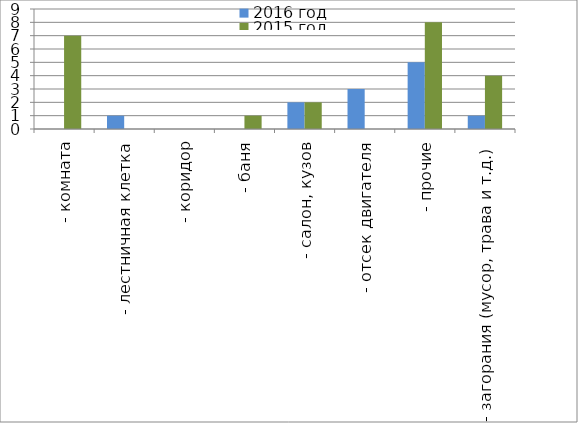
| Category | 2016 год | 2015 год |
|---|---|---|
|  - комната | 0 | 7 |
|  - лестничная клетка | 1 | 0 |
|  - коридор | 0 | 0 |
|  - баня | 0 | 1 |
|  - салон, кузов | 2 | 2 |
|  - отсек двигателя | 3 | 0 |
| - прочие | 5 | 8 |
| - загорания (мусор, трава и т.д.)  | 1 | 4 |